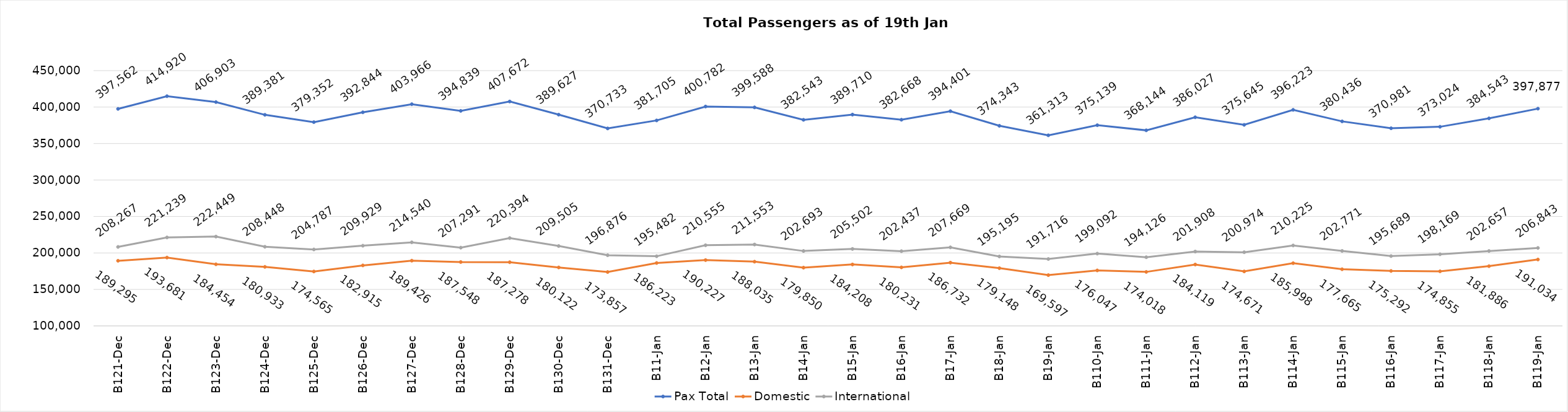
| Category | Pax Total | Domestic | International |
|---|---|---|---|
| 2023-12-21 | 397562 | 189295 | 208267 |
| 2023-12-22 | 414920 | 193681 | 221239 |
| 2023-12-23 | 406903 | 184454 | 222449 |
| 2023-12-24 | 389381 | 180933 | 208448 |
| 2023-12-25 | 379352 | 174565 | 204787 |
| 2023-12-26 | 392844 | 182915 | 209929 |
| 2023-12-27 | 403966 | 189426 | 214540 |
| 2023-12-28 | 394839 | 187548 | 207291 |
| 2023-12-29 | 407672 | 187278 | 220394 |
| 2023-12-30 | 389627 | 180122 | 209505 |
| 2023-12-31 | 370733 | 173857 | 196876 |
| 2024-01-01 | 381705 | 186223 | 195482 |
| 2024-01-02 | 400782 | 190227 | 210555 |
| 2024-01-03 | 399588 | 188035 | 211553 |
| 2024-01-04 | 382543 | 179850 | 202693 |
| 2024-01-05 | 389710 | 184208 | 205502 |
| 2024-01-06 | 382668 | 180231 | 202437 |
| 2024-01-07 | 394401 | 186732 | 207669 |
| 2024-01-08 | 374343 | 179148 | 195195 |
| 2024-01-09 | 361313 | 169597 | 191716 |
| 2024-01-10 | 375139 | 176047 | 199092 |
| 2024-01-11 | 368144 | 174018 | 194126 |
| 2024-01-12 | 386027 | 184119 | 201908 |
| 2024-01-13 | 375645 | 174671 | 200974 |
| 2024-01-14 | 396223 | 185998 | 210225 |
| 2024-01-15 | 380436 | 177665 | 202771 |
| 2024-01-16 | 370981 | 175292 | 195689 |
| 2024-01-17 | 373024 | 174855 | 198169 |
| 2024-01-18 | 384543 | 181886 | 202657 |
| 2024-01-19 | 397877 | 191034 | 206843 |